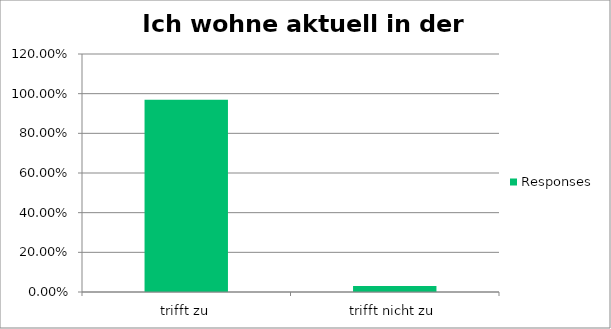
| Category | Responses |
|---|---|
| trifft zu | 0.969 |
| trifft nicht zu | 0.031 |